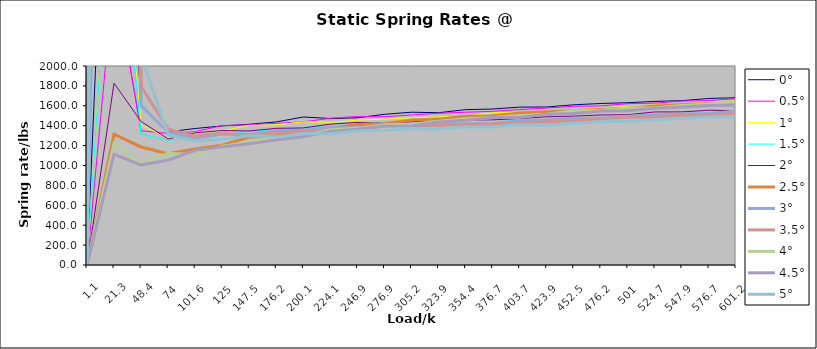
| Category | 0° | 0.5° | 1° | 1.5° | 2° | 2.5° | 3° | 3.5° | 4° | 4.5° | 5° |
|---|---|---|---|---|---|---|---|---|---|---|---|
| 1.1 | 0 | 0 | 0 | 0 | 0 | 0 | 0 | 0 | 0 | 0 | 0 |
| 21.3 | 6266.684 | 2928.095 | 4183.484 | 4173.867 | 1827.179 | 1314.571 | 13248.3 | 28173.6 | 1226.832 | 1113.096 | 23757.5 |
| 48.4 | 1610.452 | 1348.831 | 1405.802 | 1314.332 | 1442.394 | 1186.349 | 1599.548 | 1792.655 | 1008.675 | 1004.58 | 2107.705 |
| 74.0 | 1338.706 | 1323.138 | 1274.729 | 1253.106 | 1267.418 | 1118 | 1335.297 | 1367.842 | 1122.595 | 1053.781 | 1306.685 |
| 101.6 | 1371.845 | 1339.413 | 1332.616 | 1282.771 | 1328.815 | 1164.985 | 1276.993 | 1294.459 | 1107.754 | 1153.492 | 1246.211 |
| 125.0 | 1397.5 | 1401.902 | 1347.222 | 1302.956 | 1351.628 | 1203.087 | 1315.646 | 1327.24 | 1192.664 | 1187.174 | 1264.356 |
| 147.5 | 1414.28 | 1408.232 | 1402.927 | 1342.653 | 1347.333 | 1285.87 | 1310.457 | 1298.492 | 1233.88 | 1218.897 | 1298.35 |
| 176.2 | 1437.895 | 1423.729 | 1409.096 | 1358.895 | 1373.453 | 1296.135 | 1348.663 | 1328.376 | 1287.696 | 1256.302 | 1287.683 |
| 200.1 | 1487.445 | 1438.367 | 1438.645 | 1381.627 | 1377.561 | 1329.895 | 1354.5 | 1344.278 | 1295.834 | 1289.042 | 1321.394 |
| 224.1 | 1472.055 | 1475.03 | 1432.276 | 1405.97 | 1415.593 | 1372.972 | 1382.662 | 1357.054 | 1360.451 | 1344.333 | 1316.374 |
| 246.9 | 1479.283 | 1493.048 | 1455.367 | 1400.909 | 1432.93 | 1411.599 | 1375.829 | 1368.166 | 1373.136 | 1363.72 | 1350.476 |
| 276.9 | 1514.551 | 1490.123 | 1466.247 | 1437.725 | 1423.476 | 1419.953 | 1403.835 | 1397.248 | 1408.639 | 1396.482 | 1352.182 |
| 305.2 | 1535.615 | 1507.882 | 1476.724 | 1442.643 | 1439.863 | 1456.078 | 1412.26 | 1401.699 | 1414.583 | 1399.619 | 1372.951 |
| 323.9 | 1530.516 | 1524.418 | 1489.592 | 1460.787 | 1440.517 | 1466.141 | 1407.467 | 1400.961 | 1444.12 | 1436.234 | 1367.766 |
| 354.4 | 1561.147 | 1535.282 | 1491.384 | 1465.213 | 1456.937 | 1494.461 | 1418.249 | 1413.797 | 1469.312 | 1455.807 | 1388.674 |
| 376.7 | 1567.947 | 1544.888 | 1530.644 | 1481.488 | 1458.702 | 1498.008 | 1422.735 | 1418.043 | 1483.013 | 1481.668 | 1387.505 |
| 403.7 | 1586.978 | 1562.454 | 1531.224 | 1500.513 | 1471.765 | 1526.923 | 1452.244 | 1429.428 | 1503.634 | 1483.572 | 1411.143 |
| 423.9 | 1588.204 | 1577.31 | 1550.054 | 1522.719 | 1489.505 | 1540.949 | 1456.207 | 1439.366 | 1514.617 | 1516.279 | 1404.812 |
| 452.5 | 1610.105 | 1595.691 | 1555.1 | 1525.661 | 1495.972 | 1551.44 | 1475.221 | 1449.643 | 1551.173 | 1523.808 | 1425.087 |
| 476.2 | 1623.145 | 1598.585 | 1582.339 | 1552.131 | 1508.155 | 1566.454 | 1475.148 | 1468.799 | 1555.507 | 1548.62 | 1440.453 |
| 501.0 | 1631.095 | 1621.711 | 1589.825 | 1564.014 | 1510.942 | 1576.342 | 1496.138 | 1484.292 | 1578.185 | 1549.94 | 1445.53 |
| 524.7 | 1644.099 | 1626.913 | 1608.964 | 1584.232 | 1538.417 | 1598.746 | 1507.007 | 1488.398 | 1580.349 | 1575.987 | 1458.418 |
| 547.9 | 1651.975 | 1648.425 | 1614.135 | 1587.792 | 1538.647 | 1609.862 | 1518.115 | 1506.881 | 1602.544 | 1587.192 | 1473.582 |
| 576.7 | 1673.807 | 1651.996 | 1642.151 | 1611.514 | 1555.455 | 1623.331 | 1521.693 | 1505.608 | 1619.328 | 1604.039 | 1490.753 |
| 601.2 | 1681.195 | 1670.629 | 1647.651 | 1623.852 | 1550.297 | 1629.055 | 1545.104 | 1525.81 | 1639.77 | 1607.865 | 1490.915 |